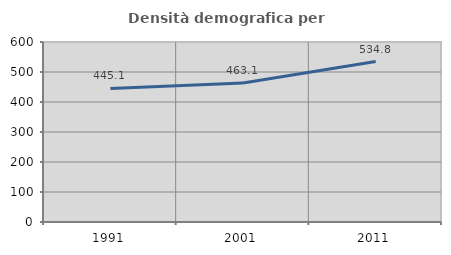
| Category | Densità demografica |
|---|---|
| 1991.0 | 445.07 |
| 2001.0 | 463.136 |
| 2011.0 | 534.844 |